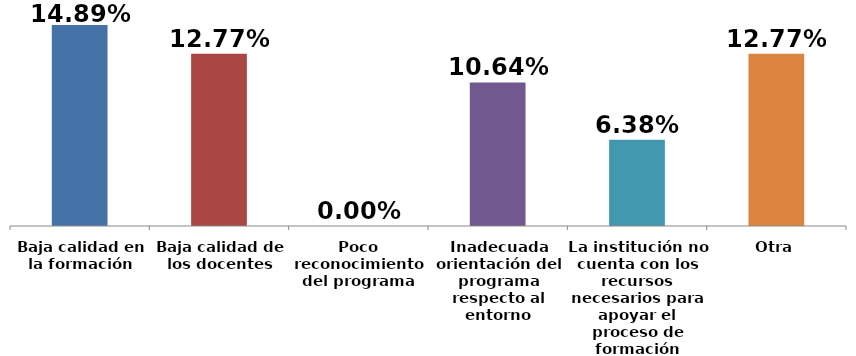
| Category | Series 0 |
|---|---|
| Baja calidad en la formación | 0.149 |
| Baja calidad de los docentes | 0.128 |
| Poco reconocimiento del programa | 0 |
| Inadecuada orientación del programa respecto al entorno | 0.106 |
| La institución no cuenta con los recursos necesarios para apoyar el proceso de formación | 0.064 |
| Otra | 0.128 |